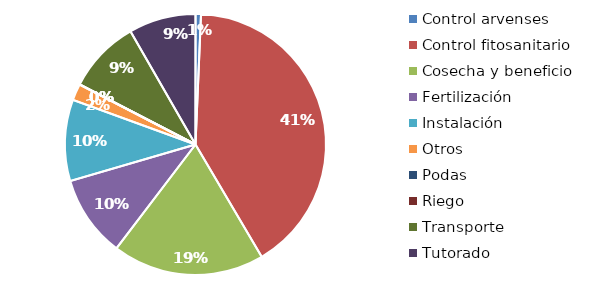
| Category | Valor |
|---|---|
| Control arvenses | 515311 |
| Control fitosanitario | 31239910 |
| Cosecha y beneficio | 14408030.74 |
| Fertilización | 7744241 |
| Instalación | 7710000 |
| Otros | 1566110 |
| Podas | 0 |
| Riego | 0 |
| Transporte | 6946000 |
| Tutorado | 6356747 |